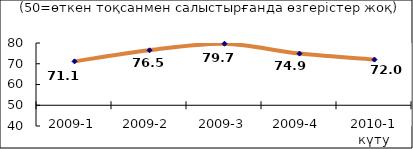
| Category | Диф.индекс ↓ |
|---|---|
| 2009-1 | 71.145 |
| 2009-2 | 76.485 |
| 2009-3 | 79.66 |
| 2009-4 | 74.905 |
| 2010-1 күту | 72.005 |